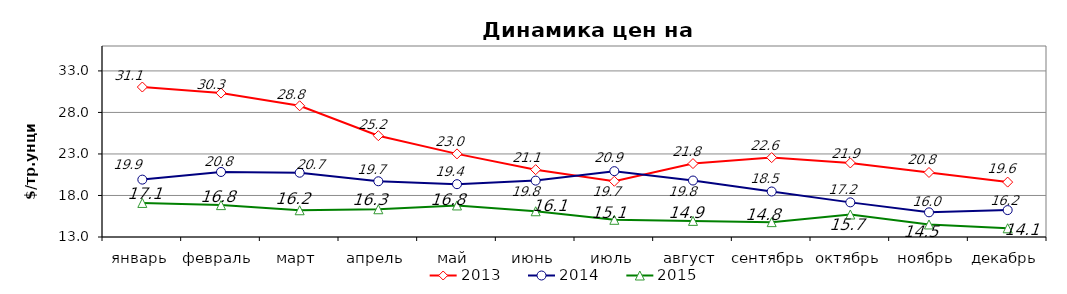
| Category | 2013 | 2014 | 2015 |
|---|---|---|---|
| январь | 31.06 | 19.91 | 17.1 |
| февраль | 30.33 | 20.83 | 16.84 |
| март | 28.8 | 20.74 | 16.22 |
| апрель | 25.2 | 19.71 | 16.34 |
| май | 23.01 | 19.36 | 16.8 |
| июнь | 21.11 | 19.79 | 16.1 |
| июль | 19.71 | 20.93 | 15.07 |
| август | 21.84 | 19.8 | 14.94 |
| сентябрь | 22.56 | 18.48 | 14.79 |
| октябрь | 21.92 | 17.17 | 15.71 |
| ноябрь | 20.77 | 15.97 | 14.51 |
| декабрь | 19.61 | 16.24 | 14.05 |